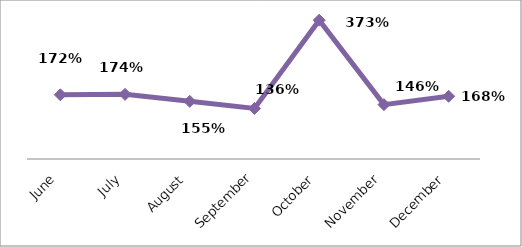
| Category | PERCENTAGE |
|---|---|
| June | 1.724 |
| July | 1.736 |
| August | 1.548 |
| September | 1.357 |
| October | 3.726 |
| November | 1.459 |
| December | 1.684 |